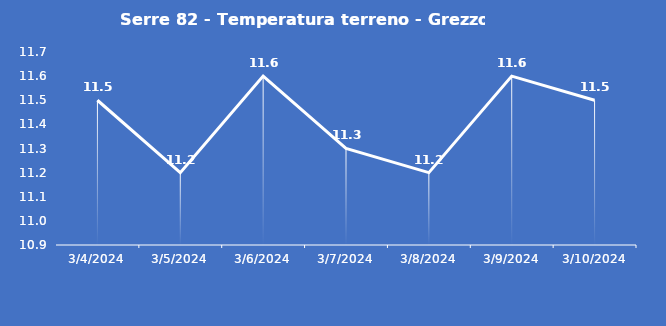
| Category | Serre 82 - Temperatura terreno - Grezzo (°C) |
|---|---|
| 3/4/24 | 11.5 |
| 3/5/24 | 11.2 |
| 3/6/24 | 11.6 |
| 3/7/24 | 11.3 |
| 3/8/24 | 11.2 |
| 3/9/24 | 11.6 |
| 3/10/24 | 11.5 |